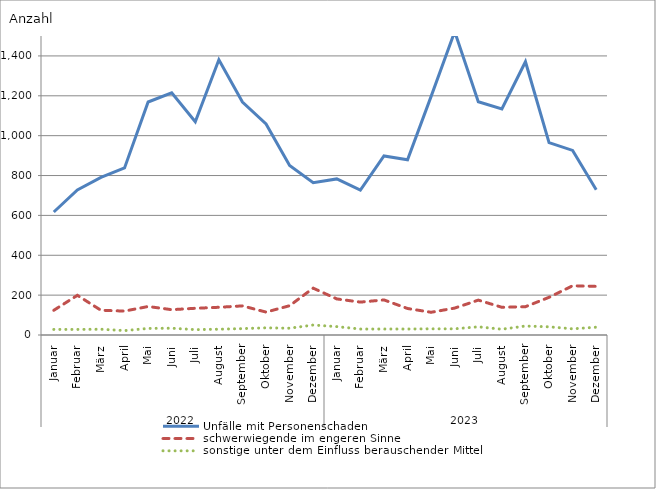
| Category | Unfälle mit Personenschaden | schwerwiegende im engeren Sinne | sonstige unter dem Einfluss berauschender Mittel |
|---|---|---|---|
| 0 | 617 | 124 | 28 |
| 1 | 728 | 199 | 28 |
| 2 | 791 | 124 | 29 |
| 3 | 838 | 120 | 22 |
| 4 | 1169 | 143 | 33 |
| 5 | 1215 | 127 | 34 |
| 6 | 1070 | 134 | 27 |
| 7 | 1381 | 139 | 29 |
| 8 | 1169 | 146 | 32 |
| 9 | 1059 | 115 | 36 |
| 10 | 850 | 147 | 34 |
| 11 | 764 | 235 | 50 |
| 12 | 783 | 181 | 42 |
| 13 | 727 | 165 | 30 |
| 14 | 898 | 176 | 30 |
| 15 | 879 | 133 | 30 |
| 16 | 1197 | 114 | 31 |
| 17 | 1522 | 135 | 31 |
| 18 | 1170 | 175 | 41 |
| 19 | 1134 | 139 | 29 |
| 20 | 1371 | 142 | 45 |
| 21 | 965 | 189 | 41 |
| 22 | 926 | 247 | 31 |
| 23 | 729 | 244 | 39 |